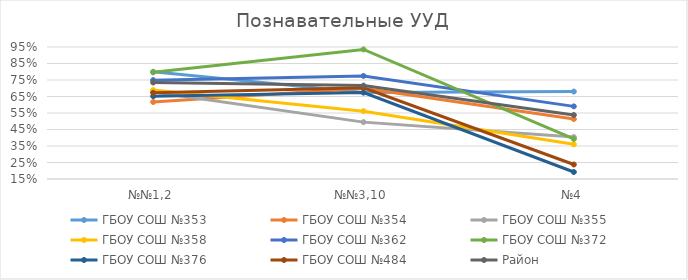
| Category | ГБОУ СОШ №353 | ГБОУ СОШ №354 | ГБОУ СОШ №355 | ГБОУ СОШ №358  | ГБОУ СОШ №362 | ГБОУ СОШ №372 | ГБОУ СОШ №376 | ГБОУ СОШ №484 | Район |
|---|---|---|---|---|---|---|---|---|---|
| №№1,2 | 0.8 | 0.617 | 0.677 | 0.689 | 0.749 | 0.796 | 0.652 | 0.672 | 0.735 |
| №№3,10 | 0.675 | 0.7 | 0.495 | 0.561 | 0.775 | 0.935 | 0.674 | 0.703 | 0.716 |
| №4 | 0.68 | 0.513 | 0.404 | 0.36 | 0.59 | 0.393 | 0.192 | 0.238 | 0.538 |